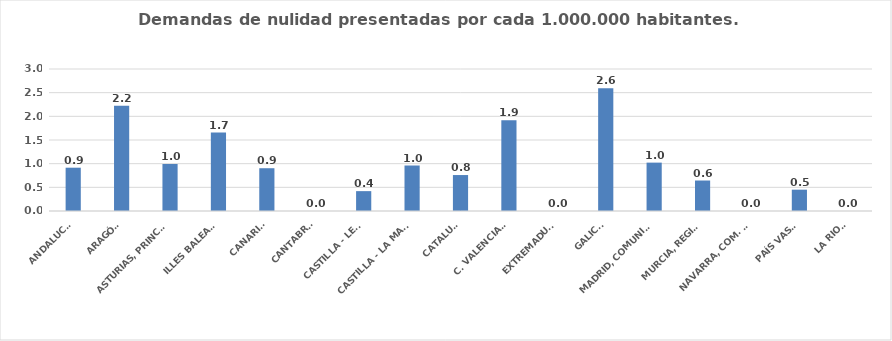
| Category | Series 0 |
|---|---|
| ANDALUCÍA | 0.915 |
| ARAGÓN | 2.223 |
| ASTURIAS, PRINCIPADO | 0.993 |
| ILLES BALEARS | 1.657 |
| CANARIAS | 0.904 |
| CANTABRIA | 0 |
| CASTILLA - LEÓN | 0.42 |
| CASTILLA - LA MANCHA | 0.961 |
| CATALUÑA | 0.76 |
| C. VALENCIANA | 1.916 |
| EXTREMADURA | 0 |
| GALICIA | 2.593 |
| MADRID, COMUNIDAD | 1.022 |
| MURCIA, REGIÓN | 0.644 |
| NAVARRA, COM. FORAL | 0 |
| PAÍS VASCO | 0.45 |
| LA RIOJA | 0 |